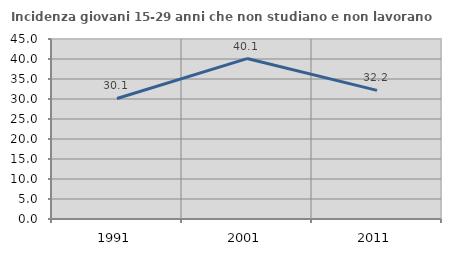
| Category | Incidenza giovani 15-29 anni che non studiano e non lavorano  |
|---|---|
| 1991.0 | 30.137 |
| 2001.0 | 40.109 |
| 2011.0 | 32.153 |